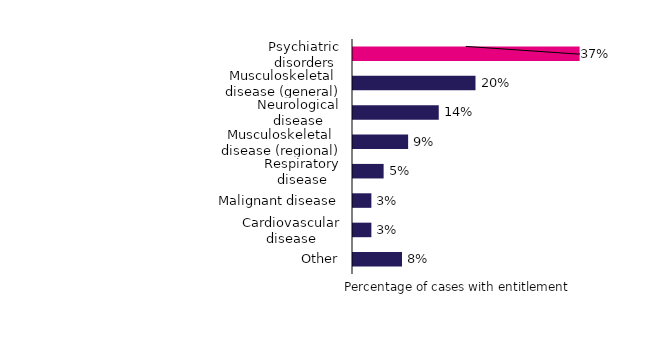
| Category | Percentage of cases |
|---|---|
| Psychiatric disorders | 0.37 |
| Musculoskeletal disease (general) | 0.2 |
| Neurological disease | 0.14 |
| Musculoskeletal disease (regional) | 0.09 |
| Respiratory disease | 0.05 |
| Malignant disease | 0.03 |
| Cardiovascular disease | 0.03 |
| Other | 0.08 |